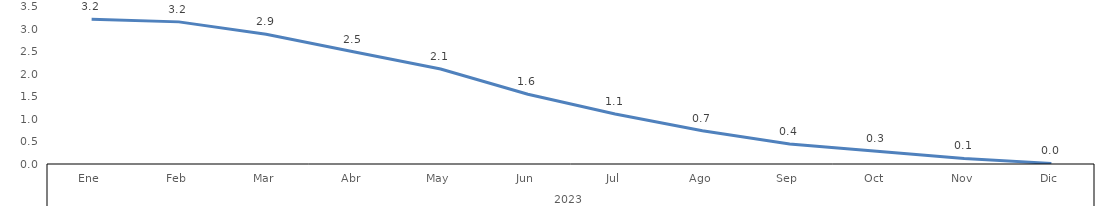
| Category | Bogotá |
|---|---|
| 0 | 3.225 |
| 1 | 3.168 |
| 2 | 2.894 |
| 3 | 2.504 |
| 4 | 2.117 |
| 5 | 1.556 |
| 6 | 1.115 |
| 7 | 0.743 |
| 8 | 0.444 |
| 9 | 0.282 |
| 10 | 0.123 |
| 11 | 0.014 |